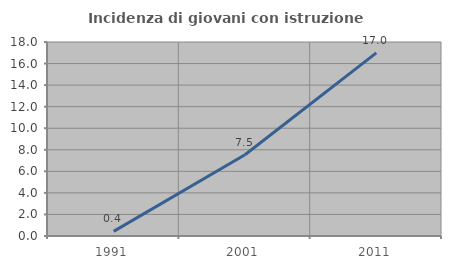
| Category | Incidenza di giovani con istruzione universitaria |
|---|---|
| 1991.0 | 0.426 |
| 2001.0 | 7.54 |
| 2011.0 | 16.996 |